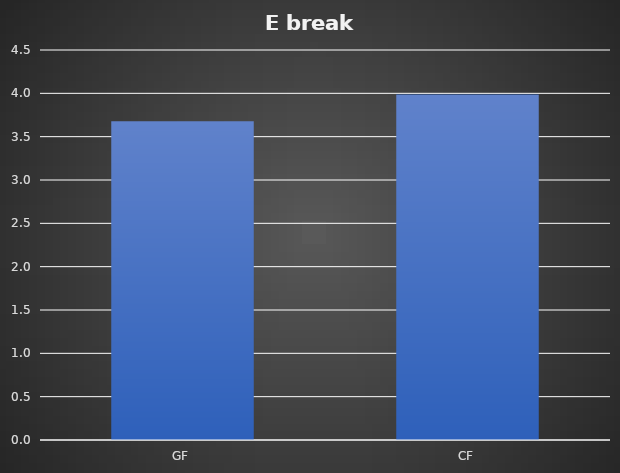
| Category | kJ/m² |
|---|---|
| GF | 3.679 |
| CF | 3.985 |